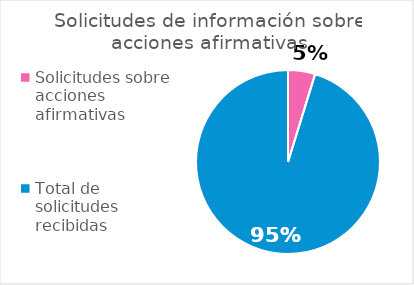
| Category | Series 0 |
|---|---|
| Solicitudes sobre acciones afirmativas | 2 |
| Total de solicitudes recibidas | 40 |